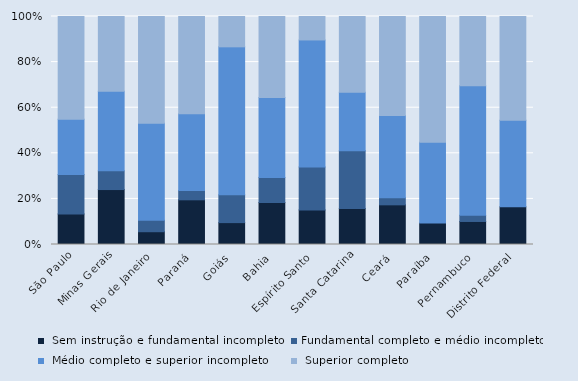
| Category |  Sem instrução e fundamental incompleto | Fundamental completo e médio incompleto |  Médio completo e superior incompleto |  Superior completo |
|---|---|---|---|---|
| São Paulo | 13.4 | 17.3 | 24.2 | 45.1 |
| Minas Gerais | 24.1 | 8.2 | 34.9 | 32.8 |
| Rio de Janeiro | 5.6 | 5 | 42.5 | 46.8 |
| Paraná | 19.6 | 4.1 | 33.7 | 42.6 |
| Goiás | 9.6 | 12.2 | 64.9 | 13.3 |
| Bahia | 18.4 | 11 | 35 | 35.5 |
| Espírito Santo | 15.2 | 18.8 | 55.8 | 10.3 |
| Santa Catarina | 15.8 | 25.3 | 25.7 | 33.2 |
| Ceará | 17.4 | 3.1 | 36.1 | 43.4 |
| Paraíba | 9.4 | 0 | 35.5 | 55.2 |
| Pernambuco | 10.1 | 2.7 | 56.8 | 30.4 |
| Distrito Federal | 16.6 | 0 | 37.9 | 45.6 |